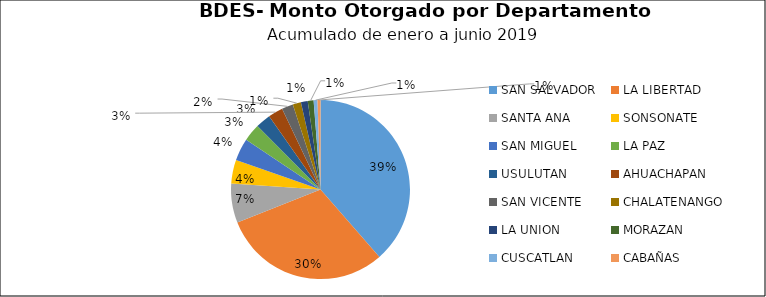
| Category | Monto | Créditos |
|---|---|---|
| SAN SALVADOR | 40.675 | 719 |
| LA LIBERTAD | 32.063 | 342 |
| SANTA ANA | 7.472 | 266 |
| SONSONATE | 4.543 | 139 |
| SAN MIGUEL | 4.259 | 396 |
| LA PAZ | 3.326 | 282 |
| USULUTAN | 2.871 | 291 |
| AHUACHAPAN | 2.806 | 156 |
| SAN VICENTE | 2.167 | 108 |
| CHALATENANGO | 1.57 | 29 |
| LA UNION | 1.297 | 130 |
| MORAZAN | 1.114 | 214 |
| CUSCATLAN | 0.733 | 42 |
| CABAÑAS | 0.563 | 39 |